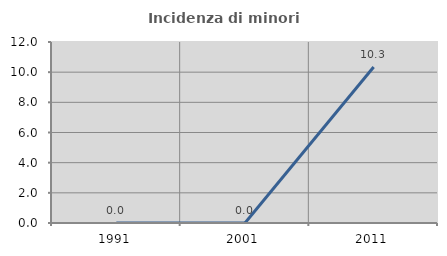
| Category | Incidenza di minori stranieri |
|---|---|
| 1991.0 | 0 |
| 2001.0 | 0 |
| 2011.0 | 10.345 |